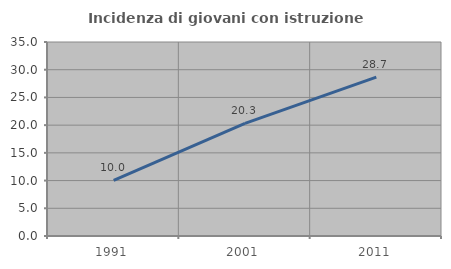
| Category | Incidenza di giovani con istruzione universitaria |
|---|---|
| 1991.0 | 10.037 |
| 2001.0 | 20.323 |
| 2011.0 | 28.664 |